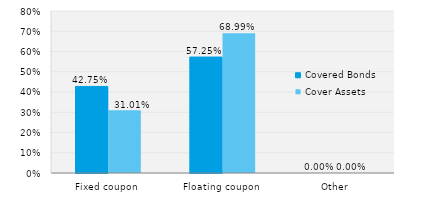
| Category | Covered Bonds | Cover Assets |
|---|---|---|
| Fixed coupon | 0.428 | 0.31 |
| Floating coupon | 0.572 | 0.69 |
| Other | 0 | 0 |